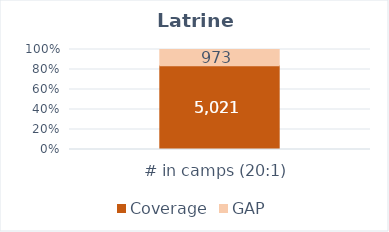
| Category |  Coverage  |  GAP  |
|---|---|---|
|  # in camps (20:1)  | 5021 | 973 |